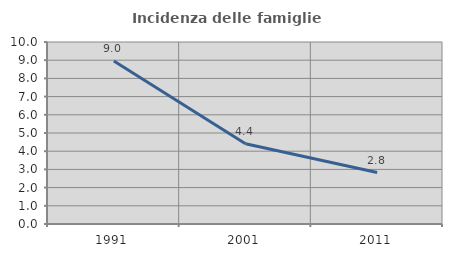
| Category | Incidenza delle famiglie numerose |
|---|---|
| 1991.0 | 8.953 |
| 2001.0 | 4.413 |
| 2011.0 | 2.828 |